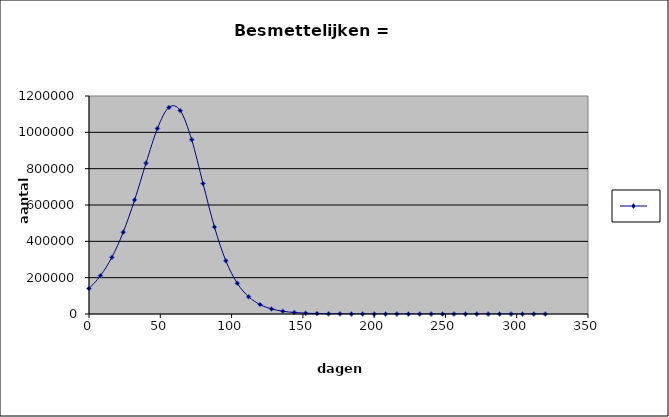
| Category | Series 0 |
|---|---|
| 0.0 | 140000 |
| 8.0 | 210560 |
| 16.0 | 311677.66 |
| 24.0 | 450386.49 |
| 32.0 | 627911.687 |
| 40.0 | 830843.182 |
| 48.0 | 1021259.524 |
| 56.0 | 1137175.624 |
| 64.0 | 1119552.373 |
| 72.0 | 959785.078 |
| 80.0 | 717978.965 |
| 88.0 | 478344.32 |
| 96.0 | 292586.886 |
| 104.0 | 169192.266 |
| 112.0 | 94568.275 |
| 120.0 | 51836.306 |
| 128.0 | 28106.36 |
| 136.0 | 15149.391 |
| 144.0 | 8139.331 |
| 152.0 | 4365.458 |
| 160.0 | 2339.197 |
| 168.0 | 1252.815 |
| 176.0 | 670.797 |
| 184.0 | 359.115 |
| 192.0 | 192.239 |
| 200.0 | 102.904 |
| 208.0 | 55.083 |
| 216.0 | 29.484 |
| 224.0 | 15.782 |
| 232.0 | 8.448 |
| 240.0 | 4.522 |
| 248.0 | 2.42 |
| 256.0 | 1.296 |
| 264.0 | 0.693 |
| 272.0 | 0.371 |
| 280.0 | 0.199 |
| 288.0 | 0.106 |
| 296.0 | 0.057 |
| 304.0 | 0.03 |
| 312.0 | 0.016 |
| 320.0 | 0.009 |